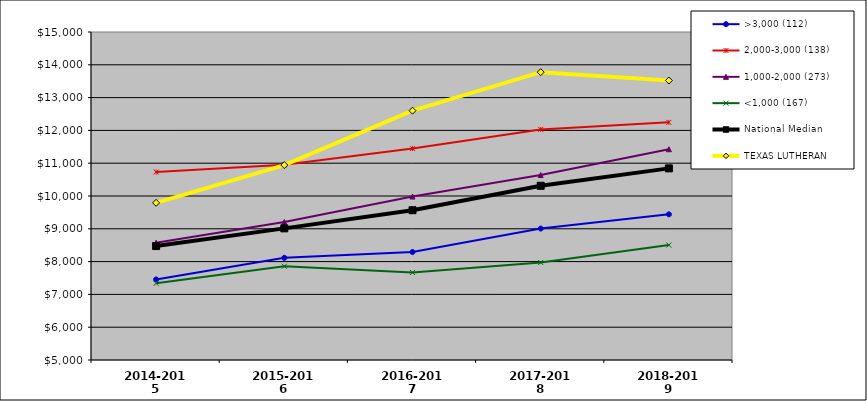
| Category | >3,000 (112) | 2,000-3,000 (138) | 1,000-2,000 (273) | <1,000 (167) | National Median | TEXAS LUTHERAN |
|---|---|---|---|---|---|---|
| 2014-2015 | 7456.142 | 10729.632 | 8573.087 | 7336.826 | 8473.314 | 9792.02 |
| 2015-2016 | 8114.911 | 10949.2 | 9206.461 | 7858.552 | 9013.486 | 10943.363 |
| 2016-2017 | 8291.855 | 11445.733 | 9983.536 | 7667.525 | 9566.64 | 12600.824 |
| 2017-2018 | 9007.036 | 12029.897 | 10638.551 | 7972.87 | 10311.147 | 13775.86 |
| 2018-2019 | 9441.442 | 12244.968 | 11425.069 | 8505.139 | 10842.044 | 13520.988 |